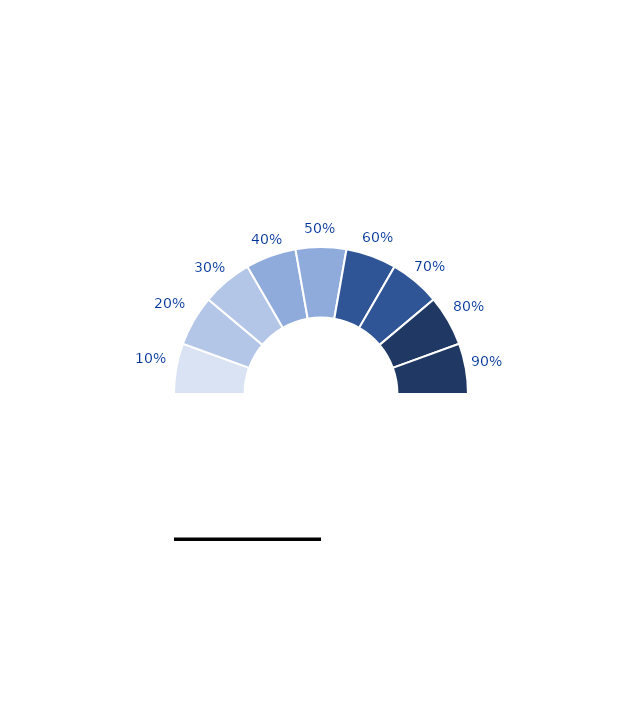
| Category | Series 0 |
|---|---|
| 0 | 1 |
| 1 | 1 |
| 2 | 1 |
| 3 | 1 |
| 4 | 1 |
| 5 | 1 |
| 6 | 1 |
| 7 | 1 |
| 8 | 1 |
| 9 | 9 |